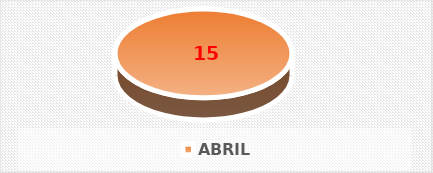
| Category | CANTIDAD |
|---|---|
| ABRIL | 15 |